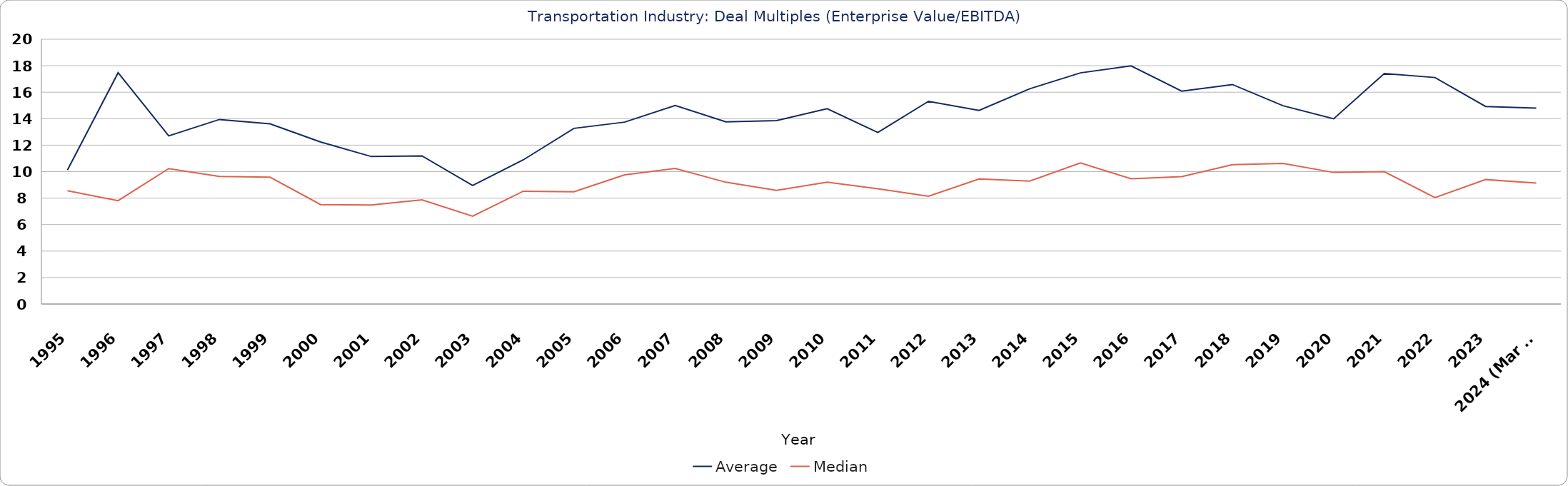
| Category | Average | Median |
|---|---|---|
| 1995 | 10.12 | 8.56 |
| 1996 | 17.47 | 7.81 |
| 1997 | 12.7 | 10.23 |
| 1998 | 13.94 | 9.64 |
| 1999 | 13.61 | 9.58 |
| 2000 | 12.24 | 7.51 |
| 2001 | 11.14 | 7.48 |
| 2002 | 11.19 | 7.87 |
| 2003 | 8.95 | 6.63 |
| 2004 | 10.89 | 8.52 |
| 2005 | 13.27 | 8.48 |
| 2006 | 13.74 | 9.76 |
| 2007 | 15 | 10.24 |
| 2008 | 13.76 | 9.2 |
| 2009 | 13.85 | 8.58 |
| 2010 | 14.75 | 9.2 |
| 2011 | 12.96 | 8.7 |
| 2012 | 15.31 | 8.14 |
| 2013 | 14.63 | 9.45 |
| 2014 | 16.26 | 9.29 |
| 2015 | 17.46 | 10.66 |
| 2016 | 17.99 | 9.46 |
| 2017 | 16.08 | 9.62 |
| 2018 | 16.58 | 10.52 |
| 2019 | 14.98 | 10.62 |
| 2020 | 13.99 | 9.94 |
| 2021 | 17.41 | 10 |
| 2022 | 17.11 | 8.04 |
| 2023 | 14.92 | 9.4 |
| 2024 (Mar 31) | 14.8 | 9.14 |